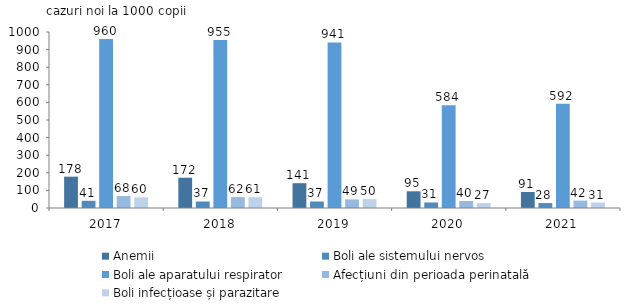
| Category | Anemii | Boli ale sistemului nervos | Boli ale aparatului respirator | Afecțiuni din perioada perinatală | Boli infecțioase și parazitare |
|---|---|---|---|---|---|
| 2017.0 | 178 | 41 | 960 | 68 | 60.2 |
| 2018.0 | 172 | 37 | 955 | 62 | 61.498 |
| 2019.0 | 141 | 37 | 941 | 49 | 50.2 |
| 2020.0 | 95 | 31.3 | 583.9 | 39.8 | 27.4 |
| 2021.0 | 91 | 28 | 592 | 42 | 31 |